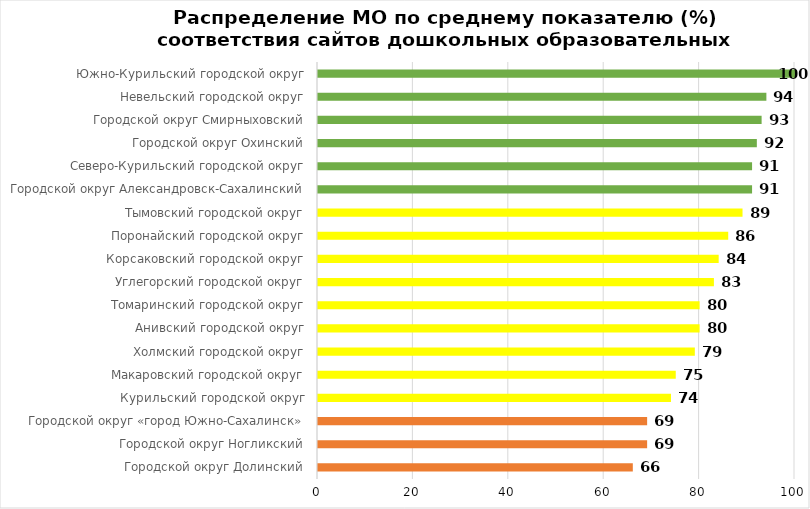
| Category | Series 0 |
|---|---|
| Городской округ Долинский | 66 |
| Городской округ Ногликский | 69 |
| Городской округ «город Южно-Сахалинск» | 69 |
| Курильский городской округ | 74 |
| Макаровский городской округ | 75 |
| Холмский городской округ | 79 |
| Анивский городской округ | 80 |
| Томаринский городской округ | 80 |
| Углегорский городской округ | 83 |
| Корсаковский городской округ | 84 |
| Поронайский городской округ | 86 |
| Тымовский городской округ | 89 |
| Городской округ Александровск-Сахалинский | 91 |
| Северо-Курильский городской округ | 91 |
| Городской округ Охинский | 92 |
| Городской округ Смирныховский | 93 |
| Невельский городской округ | 94 |
| Южно-Курильский городской округ | 100 |